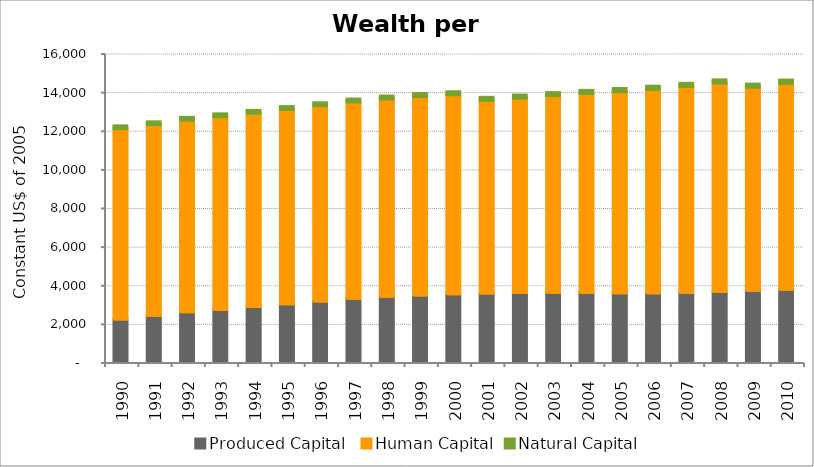
| Category | Produced Capital  | Human Capital | Natural Capital |
|---|---|---|---|
| 1990.0 | 2204.357 | 9890.937 | 91.46 |
| 1991.0 | 2377.977 | 9928.068 | 89.763 |
| 1992.0 | 2575.05 | 9963.381 | 88.121 |
| 1993.0 | 2709.589 | 10009.471 | 86.511 |
| 1994.0 | 2844.971 | 10054.868 | 84.906 |
| 1995.0 | 2989.17 | 10106.921 | 83.297 |
| 1996.0 | 3132.187 | 10160.334 | 81.669 |
| 1997.0 | 3271.012 | 10215.104 | 80.045 |
| 1998.0 | 3373.263 | 10266.801 | 78.494 |
| 1999.0 | 3442.357 | 10329.301 | 77.094 |
| 2000.0 | 3503.061 | 10360.427 | 75.889 |
| 2001.0 | 3550.151 | 10024.686 | 74.888 |
| 2002.0 | 3567.909 | 10125.291 | 74.053 |
| 2003.0 | 3583.07 | 10236.817 | 73.328 |
| 2004.0 | 3580.784 | 10353.358 | 72.64 |
| 2005.0 | 3560.001 | 10471.595 | 71.94 |
| 2006.0 | 3553.846 | 10596.127 | 71.213 |
| 2007.0 | 3581.818 | 10717.886 | 70.474 |
| 2008.0 | 3641.757 | 10837.779 | 69.727 |
| 2009.0 | 3684.029 | 10576.467 | 68.977 |
| 2010.0 | 3744.121 | 10725.923 | 68.233 |